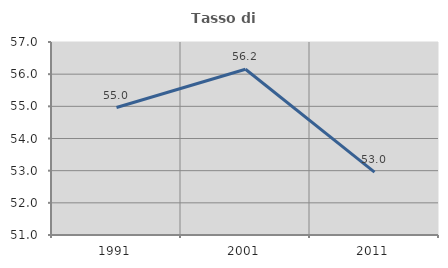
| Category | Tasso di occupazione   |
|---|---|
| 1991.0 | 54.962 |
| 2001.0 | 56.153 |
| 2011.0 | 52.956 |